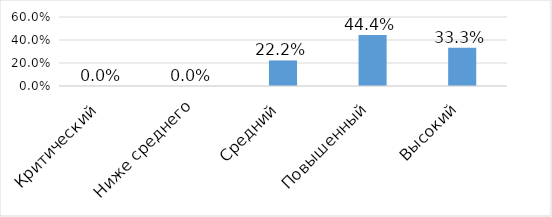
| Category | Series 0 |
|---|---|
| Критический | 0 |
| Ниже среднего | 0 |
| Средний | 0.222 |
| Повышенный | 0.444 |
| Высокий | 0.333 |